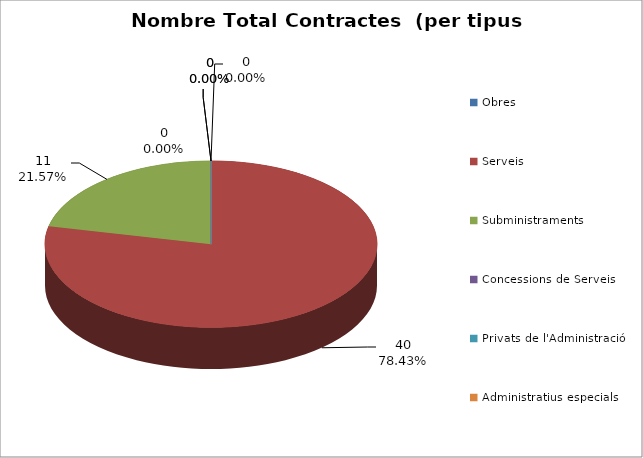
| Category | Nombre Total Contractes |
|---|---|
| Obres | 0 |
| Serveis | 40 |
| Subministraments | 11 |
| Concessions de Serveis | 0 |
| Privats de l'Administració | 0 |
| Administratius especials | 0 |